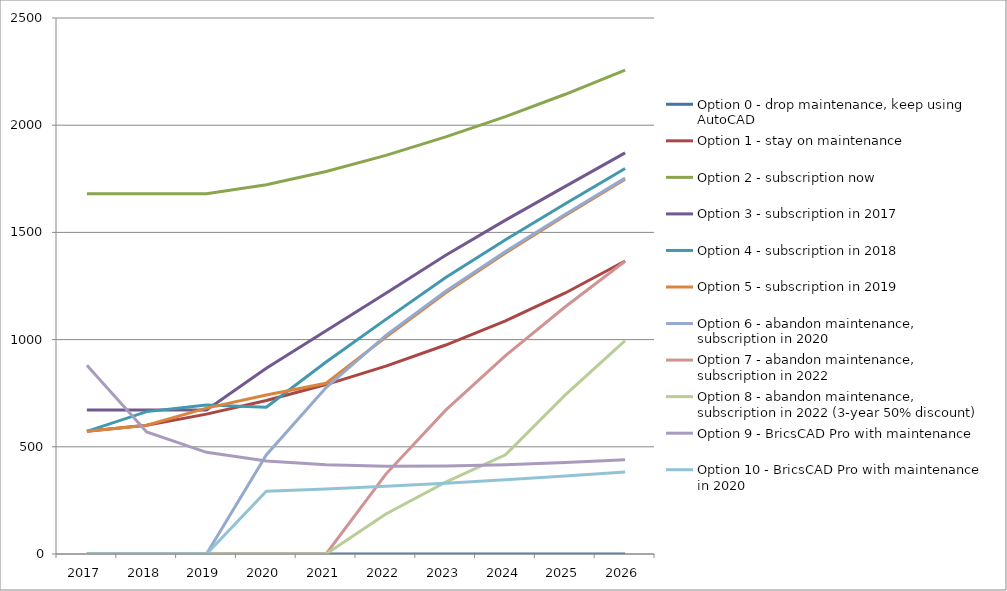
| Category | Option 0 - drop maintenance, keep using AutoCAD | Option 1 - stay on maintenance | Option 2 - subscription now | Option 3 - subscription in 2017 | Option 4 - subscription in 2018 | Option 5 - subscription in 2019 | Option 6 - abandon maintenance, subscription in 2020 | Option 7 - abandon maintenance, subscription in 2022 | Option 8 - abandon maintenance, subscription in 2022 (3-year 50% discount) | Option 9 - BricsCAD Pro with maintenance | Option 10 - BricsCAD Pro with maintenance in 2020 |
|---|---|---|---|---|---|---|---|---|---|---|---|
| 2017.0 | 0 | 572.25 | 1680 | 672 | 572.25 | 572.25 | 0 | 0 | 0 | 880 | 0 |
| 2018.0 | 0 | 600.862 | 1680 | 672 | 664.125 | 600.862 | 0 | 0 | 0 | 569.25 | 0 |
| 2019.0 | 0 | 652.365 | 1680 | 672 | 694.75 | 680.575 | 0 | 0 | 0 | 474.283 | 0 |
| 2020.0 | 0 | 715.885 | 1722 | 866.578 | 684.222 | 741.431 | 462 | 0 | 0 | 433.909 | 292.82 |
| 2021.0 | 0 | 790.254 | 1784.16 | 1041.337 | 895.452 | 796.425 | 776.16 | 0 | 0 | 415.94 | 303.069 |
| 2022.0 | 0 | 876.092 | 1859.48 | 1215.855 | 1094.285 | 1011.762 | 1019.48 | 372.68 | 186.34 | 409.695 | 315.636 |
| 2023.0 | 0 | 974.698 | 1945.224 | 1393.403 | 1289.2 | 1218.466 | 1225.224 | 670.824 | 335.412 | 410.641 | 330.019 |
| 2024.0 | 0 | 1087.811 | 2040.278 | 1557.309 | 1466.132 | 1404.24 | 1410.278 | 925.178 | 462.589 | 416.554 | 346.01 |
| 2025.0 | 0 | 1217.557 | 2144.272 | 1714.855 | 1633.808 | 1578.793 | 1584.272 | 1153.072 | 741.882 | 426.242 | 363.536 |
| 2026.0 | 0 | 1366.464 | 2257.229 | 1870.654 | 1797.712 | 1748.198 | 1753.229 | 1365.149 | 995.078 | 439.029 | 382.594 |